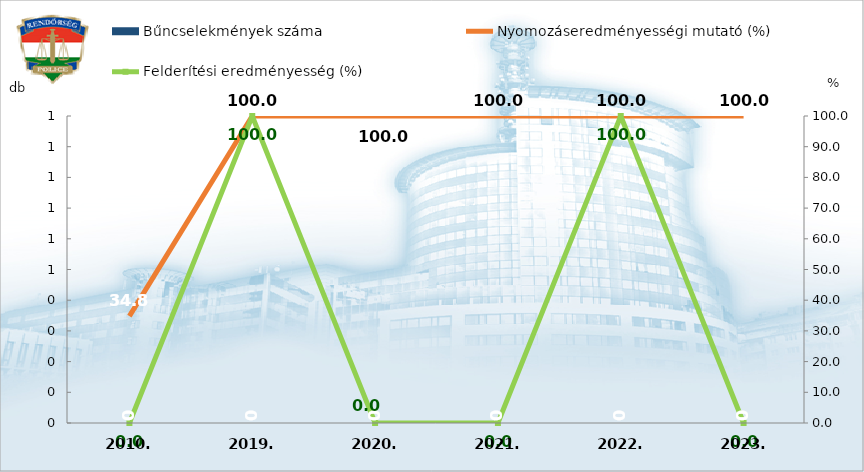
| Category | Bűncselekmények száma |
|---|---|
| 2010. | 0 |
| 2019. | 0 |
| 2020. | 0 |
| 2021. | 0 |
| 2022. | 0 |
| 2023. | 0 |